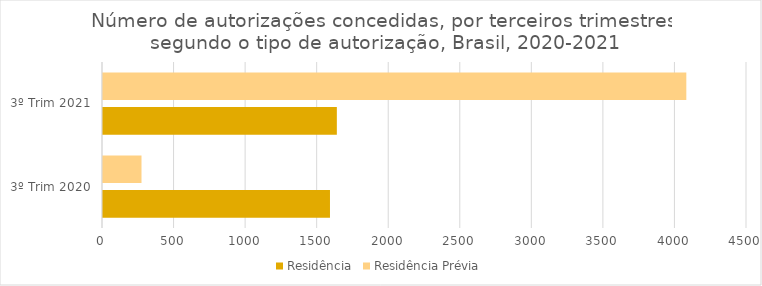
| Category | Residência | Residência Prévia |
|---|---|---|
| 3º Trim 2020 | 1586 | 269 |
| 3º Trim 2021 | 1634 | 4076 |